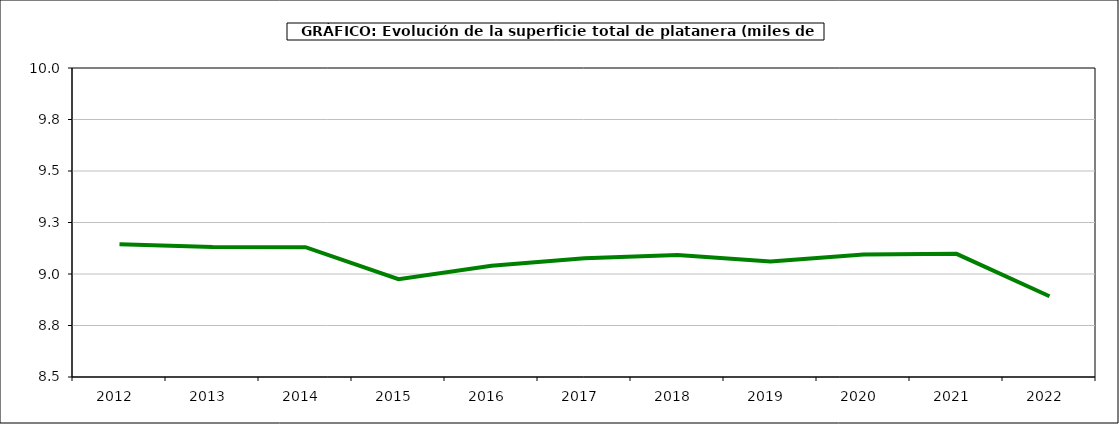
| Category | superficie platanera |
|---|---|
| 2012.0 | 9.144 |
| 2013.0 | 9.131 |
| 2014.0 | 9.13 |
| 2015.0 | 8.975 |
| 2016.0 | 9.04 |
| 2017.0 | 9.076 |
| 2018.0 | 9.092 |
| 2019.0 | 9.061 |
| 2020.0 | 9.095 |
| 2021.0 | 9.098 |
| 2022.0 | 8.892 |